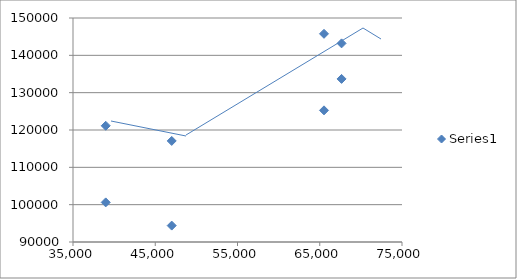
| Category | Series 0 |
|---|---|
| 38978.942085561386 | 121133 |
| 38978.942085561386 | 100607 |
| 47002.06296770232 | 117071 |
| 47002.06296770232 | 94398 |
| 65517.708157996145 | 145768 |
| 65517.708157996145 | 125265 |
| 67652.82703296604 | 143206 |
| 67652.82703296604 | 133685 |